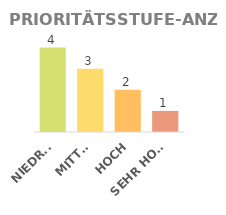
| Category | MENGE |
|---|---|
| NIEDRIG | 4 |
| MITTEL | 3 |
| HOCH | 2 |
| SEHR HOCH | 1 |